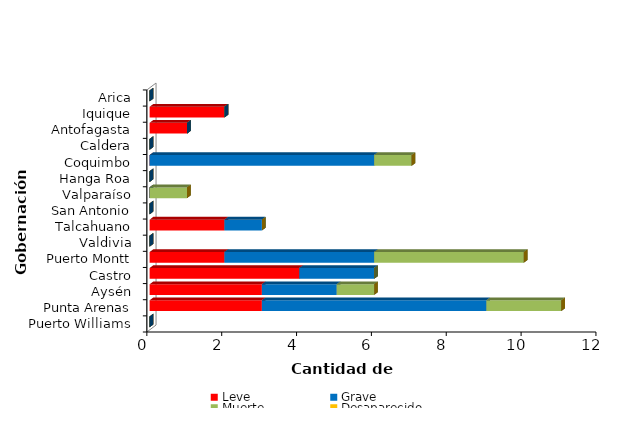
| Category | Leve | Grave | Muerte | Desaparecido |
|---|---|---|---|---|
| Arica | 0 | 0 | 0 | 0 |
| Iquique | 2 | 0 | 0 | 0 |
| Antofagasta | 1 | 0 | 0 | 0 |
| Caldera | 0 | 0 | 0 | 0 |
| Coquimbo | 0 | 6 | 1 | 0 |
| Hanga Roa | 0 | 0 | 0 | 0 |
| Valparaíso | 0 | 0 | 1 | 0 |
| San Antonio | 0 | 0 | 0 | 0 |
| Talcahuano | 2 | 1 | 0 | 0 |
| Valdivia | 0 | 0 | 0 | 0 |
| Puerto Montt | 2 | 4 | 4 | 0 |
| Castro | 4 | 2 | 0 | 0 |
| Aysén | 3 | 2 | 1 | 0 |
| Punta Arenas | 3 | 6 | 2 | 0 |
| Puerto Williams | 0 | 0 | 0 | 0 |